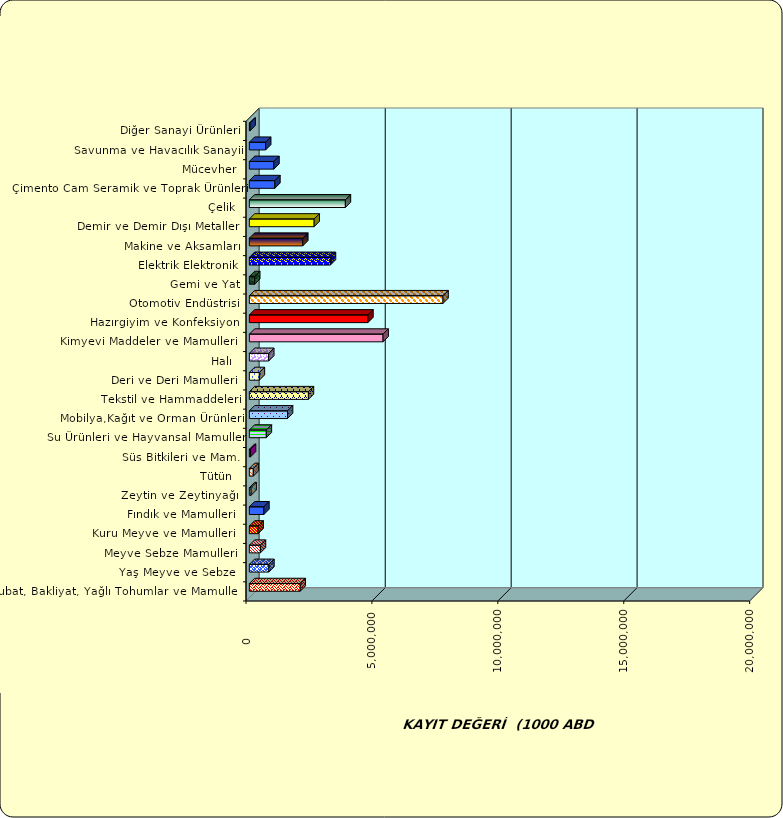
| Category | Series 0 |
|---|---|
|  Hububat, Bakliyat, Yağlı Tohumlar ve Mamulleri  | 2020172.548 |
|  Yaş Meyve ve Sebze   | 774792.606 |
|  Meyve Sebze Mamulleri  | 440090.937 |
|  Kuru Meyve ve Mamulleri   | 347198.374 |
|  Fındık ve Mamulleri  | 576655.698 |
|  Zeytin ve Zeytinyağı  | 68740.616 |
|  Tütün  | 157618.121 |
|  Süs Bitkileri ve Mam. | 45700.449 |
|  Su Ürünleri ve Hayvansal Mamuller | 674161.917 |
|  Mobilya,Kağıt ve Orman Ürünleri | 1515952.377 |
|  Tekstil ve Hammaddeleri | 2345439.166 |
|  Deri ve Deri Mamulleri  | 396960.587 |
|  Halı  | 769598.92 |
|  Kimyevi Maddeler ve Mamulleri   | 5310577.846 |
|  Hazırgiyim ve Konfeksiyon  | 4707222.577 |
|  Otomotiv Endüstrisi | 7690521.25 |
|  Gemi ve Yat | 211215.004 |
|  Elektrik Elektronik | 3219178.163 |
|  Makine ve Aksamları | 2121908.027 |
|  Demir ve Demir Dışı Metaller  | 2573572.226 |
|  Çelik | 3813479.448 |
|  Çimento Cam Seramik ve Toprak Ürünleri | 1012497.122 |
|  Mücevher | 975646.549 |
|  Savunma ve Havacılık Sanayii | 647319.112 |
|  Diğer Sanayi Ürünleri | 29762.546 |